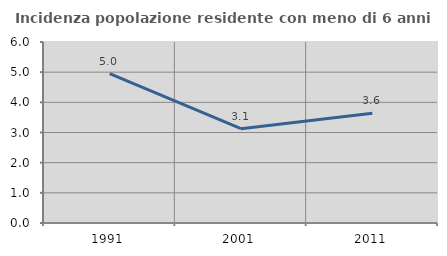
| Category | Incidenza popolazione residente con meno di 6 anni |
|---|---|
| 1991.0 | 4.95 |
| 2001.0 | 3.125 |
| 2011.0 | 3.636 |